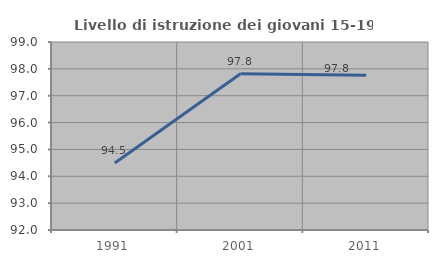
| Category | Livello di istruzione dei giovani 15-19 anni |
|---|---|
| 1991.0 | 94.493 |
| 2001.0 | 97.817 |
| 2011.0 | 97.765 |